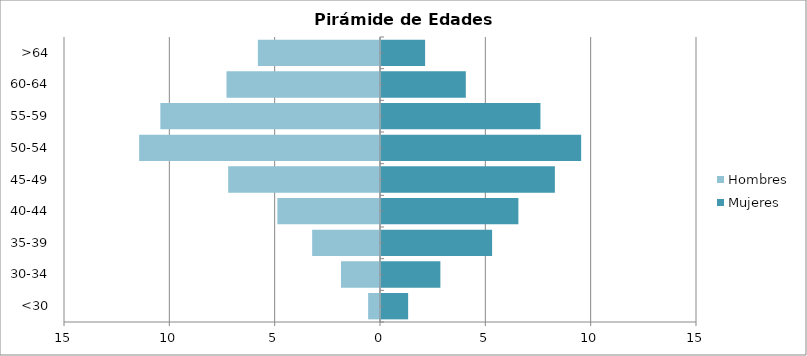
| Category | Mujeres | Hombres |
|---|---|---|
| <30 | 1.288 | -0.564 |
| 30-34 | 2.818 | -1.852 |
| 35-39 | 5.274 | -3.221 |
| 40-44 | 6.522 | -4.871 |
| 45-49 | 8.253 | -7.206 |
| 50-54 | 9.501 | -11.433 |
| 55-59 | 7.568 | -10.427 |
| 60-64 | 4.026 | -7.287 |
| >64 | 2.093 | -5.797 |